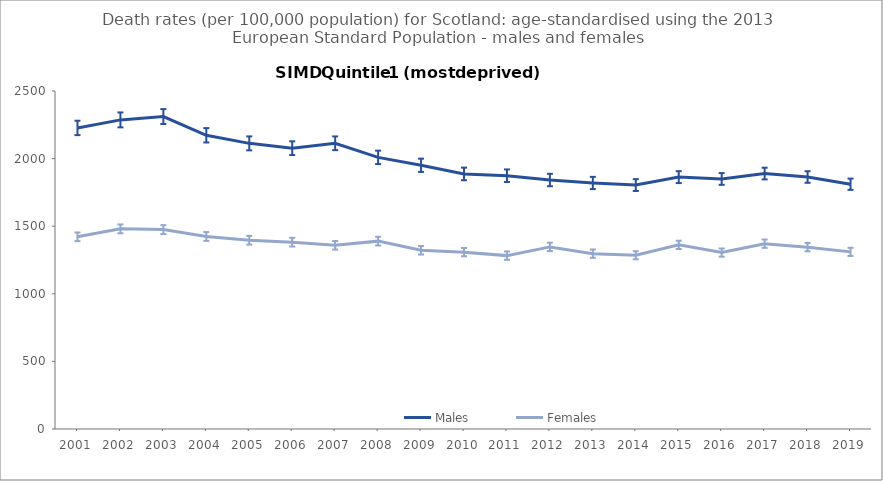
| Category | Males | Females |
|---|---|---|
| 2001.0 | 2226.9 | 1421.5 |
| 2002.0 | 2286.3 | 1480.5 |
| 2003.0 | 2311 | 1474.9 |
| 2004.0 | 2172.4 | 1424.1 |
| 2005.0 | 2112.7 | 1396.2 |
| 2006.0 | 2077.1 | 1382 |
| 2007.0 | 2113.3 | 1358.4 |
| 2008.0 | 2009.1 | 1389.5 |
| 2009.0 | 1950.6 | 1321.9 |
| 2010.0 | 1886.5 | 1308.2 |
| 2011.0 | 1873.3 | 1282.4 |
| 2012.0 | 1841.6 | 1346.9 |
| 2013.0 | 1819.7 | 1296.9 |
| 2014.0 | 1804.3 | 1285.2 |
| 2015.0 | 1863 | 1361.9 |
| 2016.0 | 1849.4 | 1304.9 |
| 2017.0 | 1889.3 | 1370.7 |
| 2018.0 | 1863.9 | 1345 |
| 2019.0 | 1810.5 | 1310.1 |